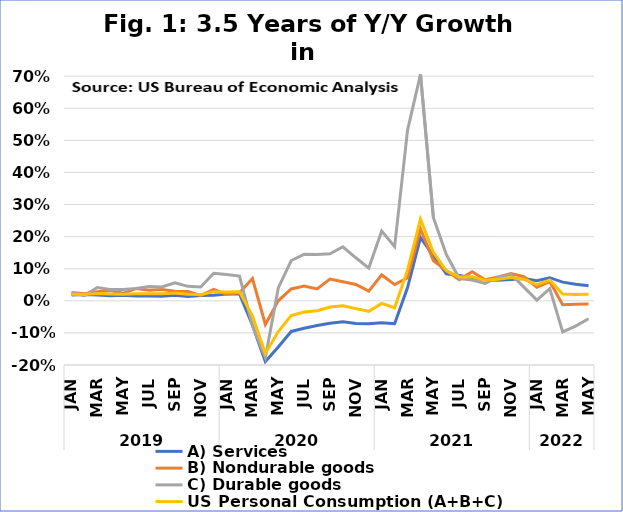
| Category | A) Services | B) Nondurable goods | C) Durable goods | US Personal Consumption (A+B+C) |
|---|---|---|---|---|
| 0 | 0.018 | 0.026 | 0.026 | 0.021 |
| 1 | 0.02 | 0.022 | 0.016 | 0.02 |
| 2 | 0.018 | 0.028 | 0.041 | 0.023 |
| 3 | 0.016 | 0.032 | 0.036 | 0.021 |
| 4 | 0.018 | 0.023 | 0.036 | 0.021 |
| 5 | 0.015 | 0.038 | 0.038 | 0.022 |
| 6 | 0.015 | 0.033 | 0.044 | 0.022 |
| 7 | 0.015 | 0.035 | 0.043 | 0.022 |
| 8 | 0.017 | 0.03 | 0.056 | 0.024 |
| 9 | 0.014 | 0.029 | 0.045 | 0.02 |
| 10 | 0.017 | 0.016 | 0.043 | 0.019 |
| 11 | 0.018 | 0.035 | 0.086 | 0.028 |
| 12 | 0.022 | 0.02 | 0.082 | 0.028 |
| 13 | 0.021 | 0.025 | 0.077 | 0.028 |
| 14 | -0.076 | 0.07 | -0.078 | -0.047 |
| 15 | -0.189 | -0.074 | -0.177 | -0.164 |
| 16 | -0.144 | 0 | 0.04 | -0.096 |
| 17 | -0.095 | 0.037 | 0.126 | -0.046 |
| 18 | -0.085 | 0.046 | 0.145 | -0.035 |
| 19 | -0.077 | 0.037 | 0.144 | -0.031 |
| 20 | -0.07 | 0.068 | 0.147 | -0.019 |
| 21 | -0.066 | 0.06 | 0.168 | -0.016 |
| 22 | -0.071 | 0.051 | 0.134 | -0.024 |
| 23 | -0.072 | 0.03 | 0.102 | -0.033 |
| 24 | -0.068 | 0.081 | 0.217 | -0.008 |
| 25 | -0.072 | 0.051 | 0.169 | -0.022 |
| 26 | 0.041 | 0.072 | 0.532 | 0.096 |
| 27 | 0.197 | 0.224 | 0.705 | 0.254 |
| 28 | 0.14 | 0.125 | 0.259 | 0.151 |
| 29 | 0.084 | 0.095 | 0.144 | 0.093 |
| 30 | 0.079 | 0.066 | 0.07 | 0.075 |
| 31 | 0.072 | 0.091 | 0.065 | 0.075 |
| 32 | 0.065 | 0.066 | 0.054 | 0.064 |
| 33 | 0.064 | 0.074 | 0.074 | 0.067 |
| 34 | 0.067 | 0.085 | 0.083 | 0.072 |
| 35 | 0.07 | 0.075 | 0.043 | 0.067 |
| 36 | 0.063 | 0.042 | 0.002 | 0.05 |
| 37 | 0.072 | 0.06 | 0.038 | 0.065 |
| 38 | 0.058 | -0.012 | -0.097 | 0.021 |
| 39 | 0.051 | -0.011 | -0.079 | 0.019 |
| 40 | 0.047 | -0.01 | -0.056 | 0.021 |